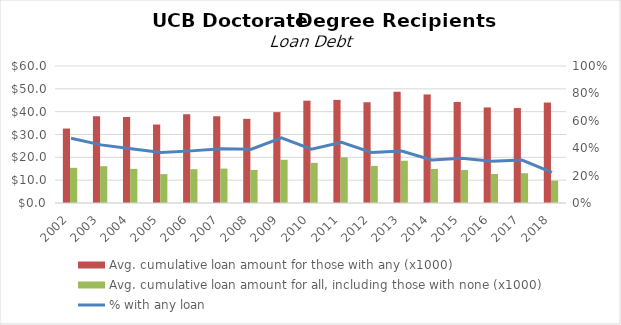
| Category | Avg. cumulative loan amount for those with any (x1000) | Avg. cumulative loan amount for all, including those with none (x1000) |
|---|---|---|
| 2002.0 | 32607.944 | 15405.328 |
| 2003.0 | 38028.675 | 16133.377 |
| 2004.0 | 37718.626 | 14952.741 |
| 2005.0 | 34368.296 | 12662.004 |
| 2006.0 | 38874.25 | 14790.54 |
| 2007.0 | 37984 | 15069.062 |
| 2008.0 | 36866.398 | 14483.228 |
| 2009.0 | 39799.05 | 18918.562 |
| 2010.0 | 44817.78 | 17581.251 |
| 2011.0 | 45162.477 | 20015.189 |
| 2012.0 | 44127.932 | 16257.659 |
| 2013.0 | 48729.025 | 18501.394 |
| 2014.0 | 47539.563 | 14919.331 |
| 2015.0 | 44255.432 | 14468.122 |
| 2016.0 | 41859.21 | 12726.041 |
| 2017.0 | 41581.64 | 13041.029 |
| 2018.0 | 43993.638 | 9813.965 |